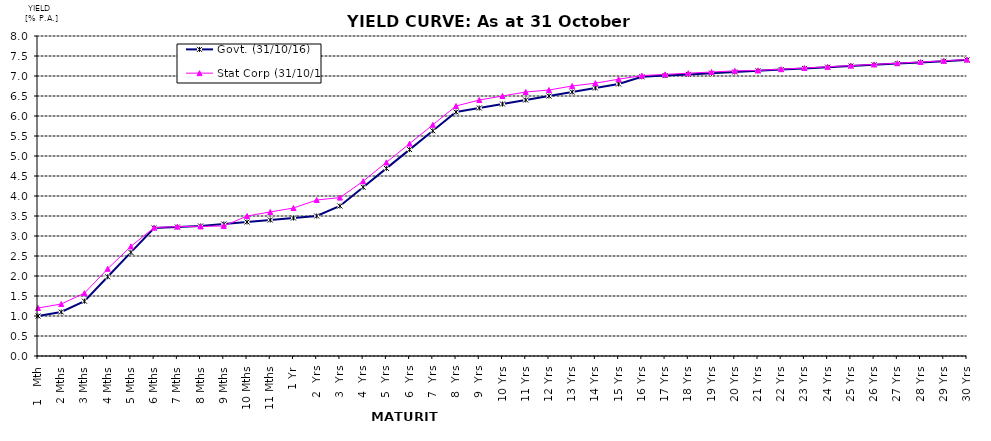
| Category | Govt. (31/10/16) | Stat Corp (31/10/16) |
|---|---|---|
| 1   Mth | 1 | 1.2 |
| 2 Mths | 1.1 | 1.3 |
| 3 Mths | 1.37 | 1.57 |
| 4 Mths | 1.98 | 2.18 |
| 5 Mths | 2.59 | 2.74 |
| 6 Mths | 3.2 | 3.21 |
| 7 Mths | 3.225 | 3.235 |
| 8 Mths | 3.25 | 3.24 |
| 9 Mths | 3.3 | 3.25 |
| 10 Mths | 3.35 | 3.5 |
| 11 Mths | 3.4 | 3.6 |
| 1 Yr | 3.45 | 3.7 |
| 2  Yrs | 3.5 | 3.9 |
| 3  Yrs | 3.75 | 3.96 |
| 4  Yrs | 4.22 | 4.37 |
| 5  Yrs | 4.69 | 4.84 |
| 6  Yrs | 5.16 | 5.31 |
| 7  Yrs | 5.63 | 5.78 |
| 8  Yrs | 6.1 | 6.25 |
| 9  Yrs | 6.2 | 6.4 |
| 10 Yrs | 6.3 | 6.5 |
| 11 Yrs | 6.4 | 6.6 |
| 12 Yrs | 6.5 | 6.65 |
| 13 Yrs | 6.6 | 6.75 |
| 14 Yrs | 6.7 | 6.82 |
| 15 Yrs | 6.8 | 6.92 |
| 16 Yrs | 6.98 | 7.01 |
| 17 Yrs | 7.01 | 7.04 |
| 18 Yrs | 7.04 | 7.07 |
| 19 Yrs | 7.07 | 7.1 |
| 20 Yrs | 7.1 | 7.13 |
| 21 Yrs | 7.13 | 7.14 |
| 22 Yrs | 7.16 | 7.17 |
| 23 Yrs | 7.19 | 7.2 |
| 24 Yrs | 7.22 | 7.23 |
| 25 Yrs | 7.25 | 7.26 |
| 26 Yrs | 7.28 | 7.29 |
| 27 Yrs | 7.31 | 7.32 |
| 28 Yrs | 7.34 | 7.35 |
| 29 Yrs | 7.37 | 7.38 |
| 30 Yrs | 7.4 | 7.41 |